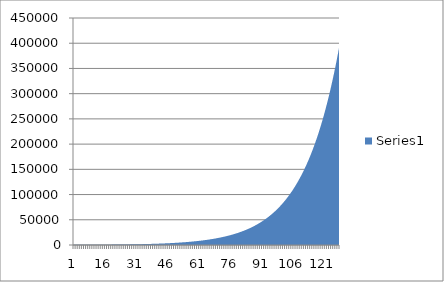
| Category | Series 0 |
|---|---|
| 0 | 262 |
| 1 | 277 |
| 2 | 294 |
| 3 | 311 |
| 4 | 330 |
| 5 | 349 |
| 6 | 370 |
| 7 | 392 |
| 8 | 415 |
| 9 | 440 |
| 10 | 466 |
| 11 | 494 |
| 12 | 523 |
| 13 | 554 |
| 14 | 587 |
| 15 | 622 |
| 16 | 659 |
| 17 | 698 |
| 18 | 740 |
| 19 | 784 |
| 20 | 831 |
| 21 | 880 |
| 22 | 932 |
| 23 | 988 |
| 24 | 1047 |
| 25 | 1109 |
| 26 | 1175 |
| 27 | 1245 |
| 28 | 1319 |
| 29 | 1397 |
| 30 | 1480 |
| 31 | 1568 |
| 32 | 1661 |
| 33 | 1760 |
| 34 | 1865 |
| 35 | 1976 |
| 36 | 2093 |
| 37 | 2217 |
| 38 | 2349 |
| 39 | 2489 |
| 40 | 2637 |
| 41 | 2794 |
| 42 | 2960 |
| 43 | 3136 |
| 44 | 3322 |
| 45 | 3520 |
| 46 | 3729 |
| 47 | 3951 |
| 48 | 4186 |
| 49 | 4435 |
| 50 | 4699 |
| 51 | 4978 |
| 52 | 5274 |
| 53 | 5588 |
| 54 | 5920 |
| 55 | 6272 |
| 56 | 6645 |
| 57 | 7040 |
| 58 | 7459 |
| 59 | 7902 |
| 60 | 8372 |
| 61 | 8870 |
| 62 | 9397 |
| 63 | 9956 |
| 64 | 10548 |
| 65 | 11175 |
| 66 | 11840 |
| 67 | 12544 |
| 68 | 13290 |
| 69 | 14080 |
| 70 | 14917 |
| 71 | 15804 |
| 72 | 16744 |
| 73 | 17740 |
| 74 | 18795 |
| 75 | 19912 |
| 76 | 21096 |
| 77 | 22351 |
| 78 | 23680 |
| 79 | 25088 |
| 80 | 26580 |
| 81 | 28160 |
| 82 | 29834 |
| 83 | 31609 |
| 84 | 33488 |
| 85 | 35479 |
| 86 | 37589 |
| 87 | 39824 |
| 88 | 42192 |
| 89 | 44701 |
| 90 | 47359 |
| 91 | 50175 |
| 92 | 53159 |
| 93 | 56320 |
| 94 | 59669 |
| 95 | 63217 |
| 96 | 66976 |
| 97 | 70959 |
| 98 | 75178 |
| 99 | 79649 |
| 100 | 84385 |
| 101 | 89402 |
| 102 | 94719 |
| 103 | 100351 |
| 104 | 106318 |
| 105 | 112640 |
| 106 | 119338 |
| 107 | 126434 |
| 108 | 133952 |
| 109 | 141918 |
| 110 | 150356 |
| 111 | 159297 |
| 112 | 168769 |
| 113 | 178805 |
| 114 | 189437 |
| 115 | 200702 |
| 116 | 212636 |
| 117 | 225280 |
| 118 | 238676 |
| 119 | 252868 |
| 120 | 267905 |
| 121 | 283835 |
| 122 | 300713 |
| 123 | 318594 |
| 124 | 337539 |
| 125 | 357610 |
| 126 | 378874 |
| 127 | 401403 |